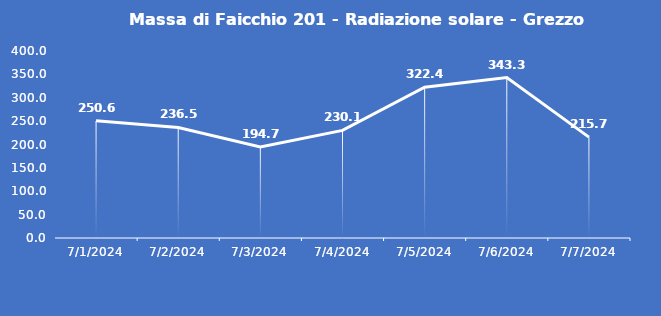
| Category | Massa di Faicchio 201 - Radiazione solare - Grezzo (W/m2) |
|---|---|
| 7/1/24 | 250.6 |
| 7/2/24 | 236.5 |
| 7/3/24 | 194.7 |
| 7/4/24 | 230.1 |
| 7/5/24 | 322.4 |
| 7/6/24 | 343.3 |
| 7/7/24 | 215.7 |